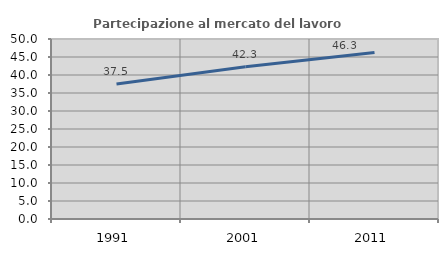
| Category | Partecipazione al mercato del lavoro  femminile |
|---|---|
| 1991.0 | 37.52 |
| 2001.0 | 42.28 |
| 2011.0 | 46.282 |